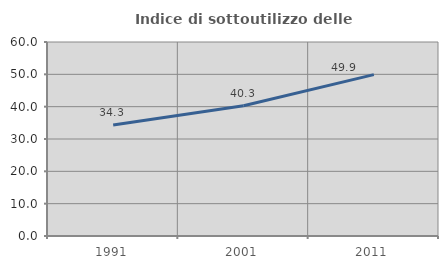
| Category | Indice di sottoutilizzo delle abitazioni  |
|---|---|
| 1991.0 | 34.333 |
| 2001.0 | 40.303 |
| 2011.0 | 49.922 |